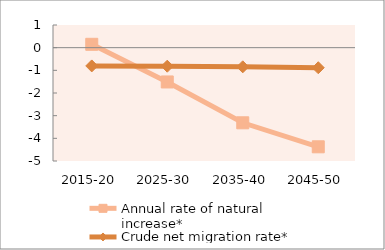
| Category | Annual rate of natural increase* | Crude net migration rate* |
|---|---|---|
| 2015-20 | 0.148 | -0.806 |
| 2025-30 | -1.513 | -0.818 |
| 2035-40 | -3.315 | -0.845 |
| 2045-50 | -4.374 | -0.886 |